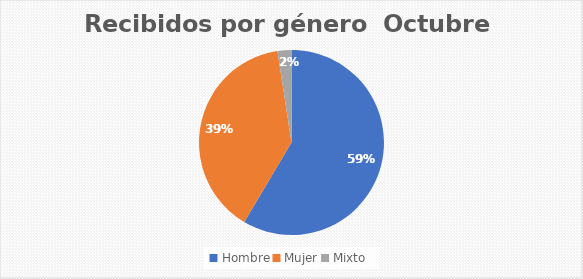
| Category | Recibidos por género  Cantidad |
|---|---|
| Hombre | 24 |
| Mujer | 16 |
| Mixto | 1 |